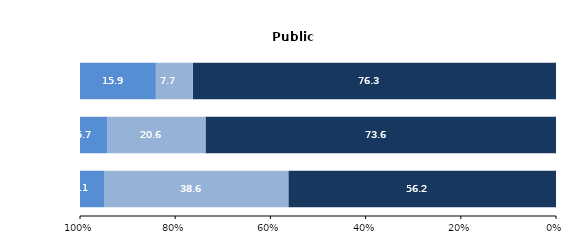
| Category | État (1) | Collectivités territoriales | Autres (2) |
|---|---|---|---|
| Établissements du premier degré | 56.229 | 38.634 | 5.137 |
| Établissements du second degré (3) | 73.642 | 20.618 | 5.74 |
| Établissements du supérieur | 76.317 | 7.744 | 15.939 |